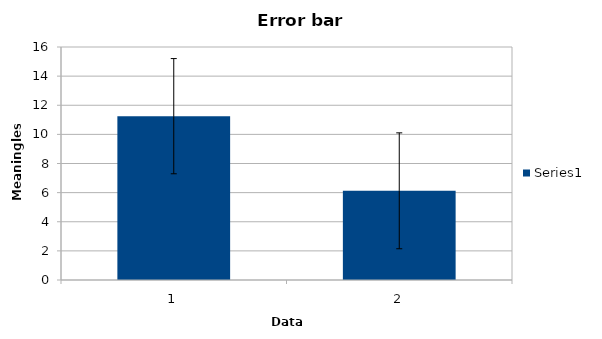
| Category | Series 0 |
|---|---|
| 0 | 11.25 |
| 1 | 6.125 |